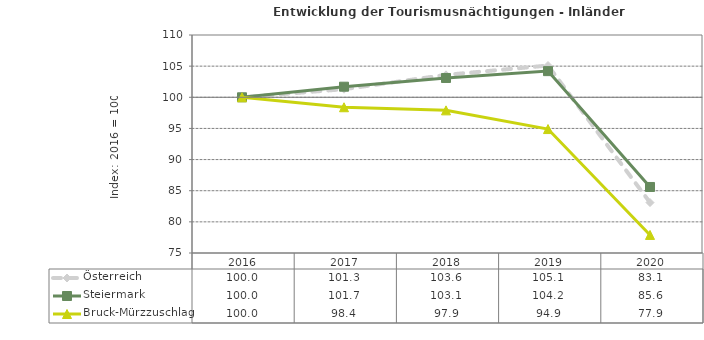
| Category | Österreich | Steiermark | Bruck-Mürzzuschlag |
|---|---|---|---|
| 2020.0 | 83.1 | 85.6 | 77.9 |
| 2019.0 | 105.1 | 104.2 | 94.9 |
| 2018.0 | 103.6 | 103.1 | 97.9 |
| 2017.0 | 101.3 | 101.7 | 98.4 |
| 2016.0 | 100 | 100 | 100 |